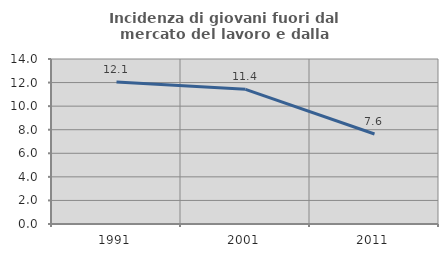
| Category | Incidenza di giovani fuori dal mercato del lavoro e dalla formazione  |
|---|---|
| 1991.0 | 12.057 |
| 2001.0 | 11.429 |
| 2011.0 | 7.634 |